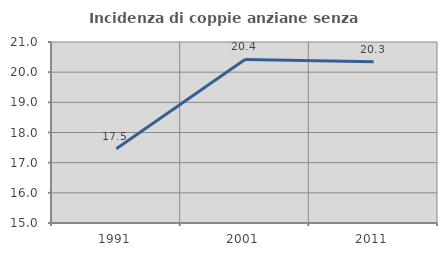
| Category | Incidenza di coppie anziane senza figli  |
|---|---|
| 1991.0 | 17.465 |
| 2001.0 | 20.423 |
| 2011.0 | 20.342 |